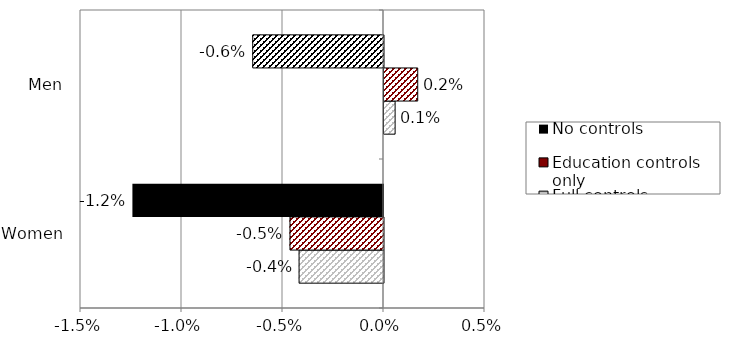
| Category | Full controls | Education controls only | No controls |
|---|---|---|---|
| Women | -0.004 | -0.005 | -0.012 |
| Men | 0.001 | 0.002 | -0.006 |